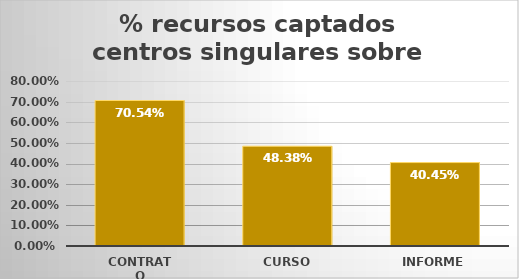
| Category | Series 0 |
|---|---|
| Contrato | 0.705 |
| Curso | 0.484 |
| Informe | 0.404 |